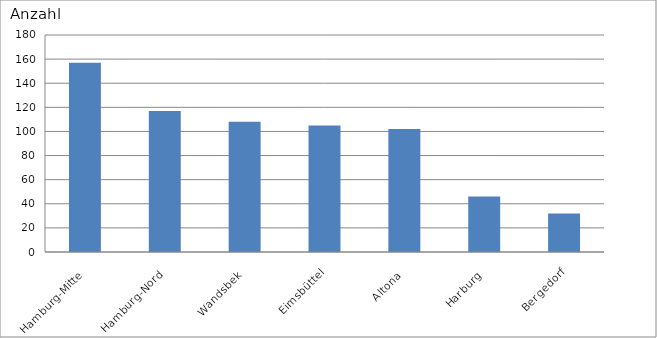
| Category | Hamburg-Mitte Hamburg-Nord Wandsbek Eimsbüttel Altona Harburg Bergedorf |
|---|---|
| Hamburg-Mitte | 157 |
| Hamburg-Nord | 117 |
| Wandsbek | 108 |
| Eimsbüttel | 105 |
| Altona | 102 |
| Harburg | 46 |
| Bergedorf | 32 |